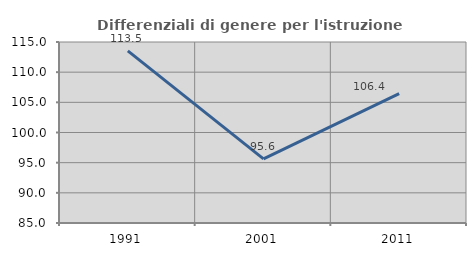
| Category | Differenziali di genere per l'istruzione superiore |
|---|---|
| 1991.0 | 113.529 |
| 2001.0 | 95.632 |
| 2011.0 | 106.442 |